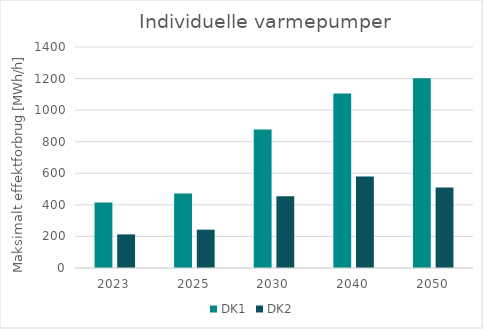
| Category | DK1 | DK2 |
|---|---|---|
| 2023.0 | 415.331 | 212.895 |
| 2025.0 | 472.708 | 242.931 |
| 2030.0 | 877.773 | 454.886 |
| 2040.0 | 1105.257 | 579.607 |
| 2050.0 | 1202.688 | 509.636 |